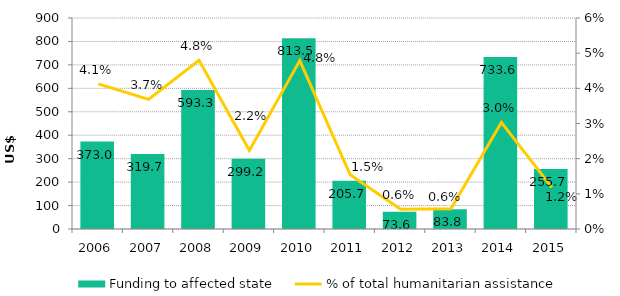
| Category | Funding to affected state |
|---|---|
| 2006.0 | 373.019 |
| 2007.0 | 319.742 |
| 2008.0 | 593.332 |
| 2009.0 | 299.22 |
| 2010.0 | 813.495 |
| 2011.0 | 205.677 |
| 2012.0 | 73.644 |
| 2013.0 | 83.765 |
| 2014.0 | 733.645 |
| 2015.0 | 255.728 |